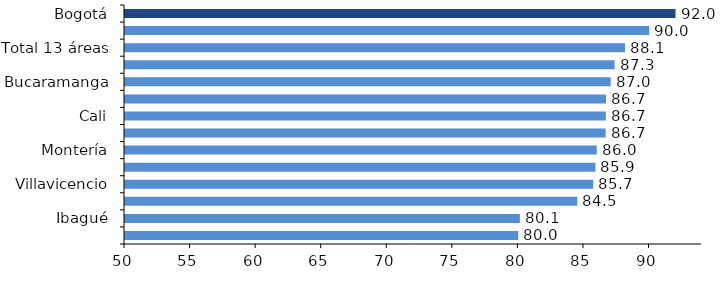
| Category | Series 0 |
|---|---|
| Bogotá | 91.981 |
| Pasto | 89.971 |
| Total 13 áreas | 88.127 |
| Medellín | 87.333 |
| Bucaramanga | 87.037 |
| Pereira | 86.682 |
| Cali | 86.666 |
| Cartagena | 86.653 |
| Montería | 85.973 |
| Manizales | 85.876 |
| Villavicencio | 85.706 |
| Barranquilla | 84.491 |
| Ibagué | 80.108 |
| Cúcuta | 79.988 |